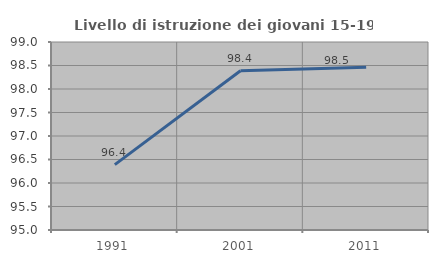
| Category | Livello di istruzione dei giovani 15-19 anni |
|---|---|
| 1991.0 | 96.392 |
| 2001.0 | 98.387 |
| 2011.0 | 98.462 |